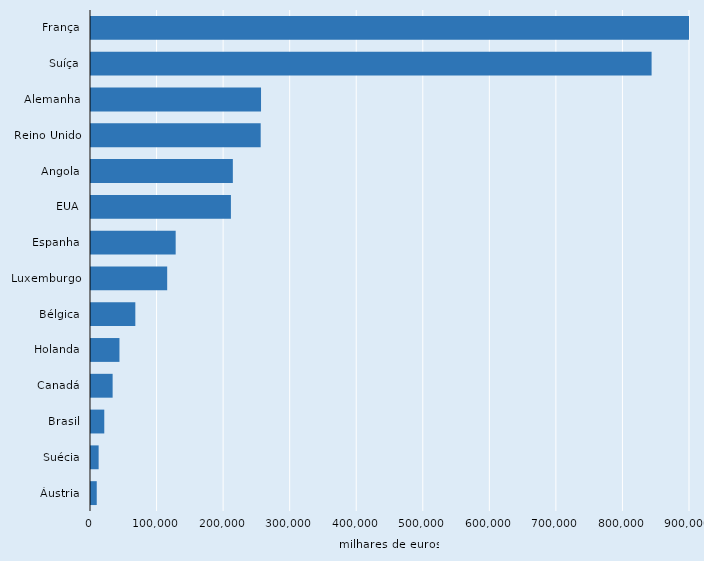
| Category | Series 2 |
|---|---|
| França | 1033120 |
| Suíça | 842290 |
| Alemanha | 255470 |
| Reino Unido | 254960 |
| Angola | 213120 |
| EUA | 210220 |
| Espanha | 127220 |
| Luxemburgo | 114470 |
| Bélgica | 66600 |
| Holanda | 42760 |
| Canadá | 32490 |
| Brasil | 19950 |
| Suécia | 11470 |
| Áustria | 8630 |